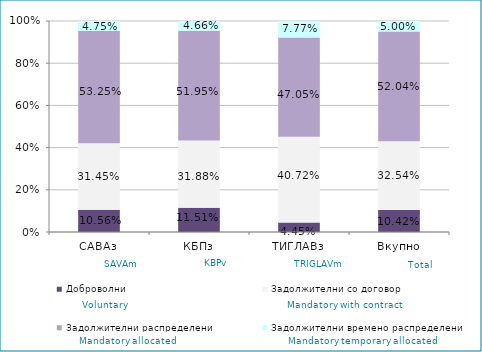
| Category | Доброволни  | Задолжителни со договор  | Задолжителни распределени  | Задолжителни времено распределени  |
|---|---|---|---|---|
| САВАз | 0.106 | 0.314 | 0.532 | 0.047 |
| КБПз | 0.115 | 0.319 | 0.52 | 0.047 |
| ТИГЛАВз | 0.045 | 0.407 | 0.471 | 0.078 |
| Вкупно | 0.104 | 0.325 | 0.52 | 0.05 |